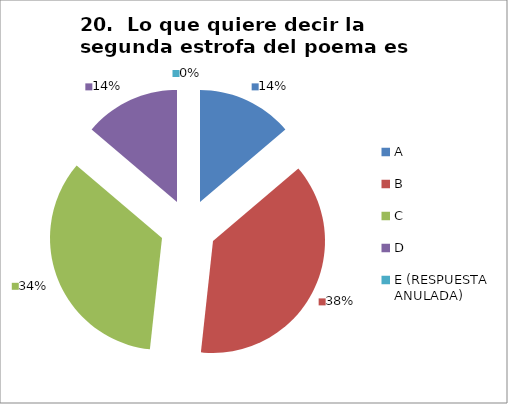
| Category | CANTIDAD DE RESPUESTAS PREGUNTA (20) | PORCENTAJE |
|---|---|---|
| A | 4 | 0.138 |
| B | 11 | 0.379 |
| C | 10 | 0.345 |
| D | 4 | 0.138 |
| E (RESPUESTA ANULADA) | 0 | 0 |